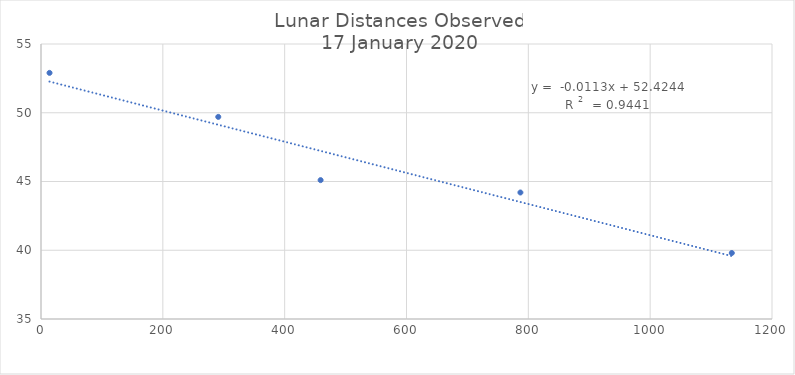
| Category | Series 0 |
|---|---|
| 14.0 | 52.9 |
| 291.0 | 49.7 |
| 459.0 | 45.1 |
| 787.0 | 44.2 |
| 1134.0 | 39.8 |